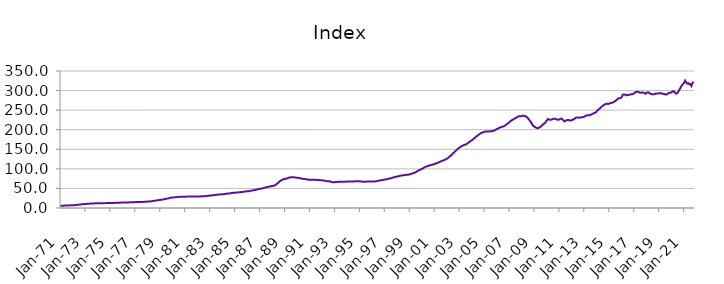
| Category | Index |
|---|---|
| 1971-01-01 | 5.879 |
| 1971-02-01 | 5.921 |
| 1971-03-01 | 5.963 |
| 1971-04-01 | 6.018 |
| 1971-05-01 | 6.108 |
| 1971-06-01 | 6.203 |
| 1971-07-01 | 6.32 |
| 1971-08-01 | 6.446 |
| 1971-09-01 | 6.572 |
| 1971-10-01 | 6.703 |
| 1971-11-01 | 6.844 |
| 1971-12-01 | 7.015 |
| 1972-01-01 | 7.135 |
| 1972-02-01 | 7.213 |
| 1972-03-01 | 7.39 |
| 1972-04-01 | 7.638 |
| 1972-05-01 | 7.997 |
| 1972-06-01 | 8.312 |
| 1972-07-01 | 8.674 |
| 1972-08-01 | 9.023 |
| 1972-09-01 | 9.332 |
| 1972-10-01 | 9.62 |
| 1972-11-01 | 9.887 |
| 1972-12-01 | 10.162 |
| 1973-01-01 | 10.359 |
| 1973-02-01 | 10.498 |
| 1973-03-01 | 10.658 |
| 1973-04-01 | 10.841 |
| 1973-05-01 | 11.075 |
| 1973-06-01 | 11.227 |
| 1973-07-01 | 11.386 |
| 1973-08-01 | 11.562 |
| 1973-09-01 | 11.768 |
| 1973-10-01 | 11.982 |
| 1973-11-01 | 12.145 |
| 1973-12-01 | 12.262 |
| 1974-01-01 | 12.324 |
| 1974-02-01 | 12.392 |
| 1974-03-01 | 12.389 |
| 1974-04-01 | 12.362 |
| 1974-05-01 | 12.339 |
| 1974-06-01 | 12.34 |
| 1974-07-01 | 12.352 |
| 1974-08-01 | 12.392 |
| 1974-09-01 | 12.465 |
| 1974-10-01 | 12.555 |
| 1974-11-01 | 12.63 |
| 1974-12-01 | 12.703 |
| 1975-01-01 | 12.737 |
| 1975-02-01 | 12.78 |
| 1975-03-01 | 12.857 |
| 1975-04-01 | 12.965 |
| 1975-05-01 | 13.097 |
| 1975-06-01 | 13.168 |
| 1975-07-01 | 13.237 |
| 1975-08-01 | 13.332 |
| 1975-09-01 | 13.462 |
| 1975-10-01 | 13.606 |
| 1975-11-01 | 13.732 |
| 1975-12-01 | 13.867 |
| 1976-01-01 | 13.963 |
| 1976-02-01 | 14.052 |
| 1976-03-01 | 14.114 |
| 1976-04-01 | 14.179 |
| 1976-05-01 | 14.264 |
| 1976-06-01 | 14.32 |
| 1976-07-01 | 14.382 |
| 1976-08-01 | 14.474 |
| 1976-09-01 | 14.605 |
| 1976-10-01 | 14.752 |
| 1976-11-01 | 14.87 |
| 1976-12-01 | 14.976 |
| 1977-01-01 | 15.034 |
| 1977-02-01 | 15.102 |
| 1977-03-01 | 15.145 |
| 1977-04-01 | 15.197 |
| 1977-05-01 | 15.276 |
| 1977-06-01 | 15.347 |
| 1977-07-01 | 15.436 |
| 1977-08-01 | 15.557 |
| 1977-09-01 | 15.705 |
| 1977-10-01 | 15.871 |
| 1977-11-01 | 16.048 |
| 1977-12-01 | 16.278 |
| 1978-01-01 | 16.449 |
| 1978-02-01 | 16.582 |
| 1978-03-01 | 16.762 |
| 1978-04-01 | 17.003 |
| 1978-05-01 | 17.391 |
| 1978-06-01 | 17.783 |
| 1978-07-01 | 18.258 |
| 1978-08-01 | 18.744 |
| 1978-09-01 | 19.213 |
| 1978-10-01 | 19.678 |
| 1978-11-01 | 20.113 |
| 1978-12-01 | 20.542 |
| 1979-01-01 | 20.797 |
| 1979-02-01 | 20.968 |
| 1979-03-01 | 21.394 |
| 1979-04-01 | 21.979 |
| 1979-05-01 | 22.725 |
| 1979-06-01 | 23.198 |
| 1979-07-01 | 23.69 |
| 1979-08-01 | 24.243 |
| 1979-09-01 | 24.906 |
| 1979-10-01 | 25.613 |
| 1979-11-01 | 26.202 |
| 1979-12-01 | 26.66 |
| 1980-01-01 | 26.911 |
| 1980-02-01 | 27.107 |
| 1980-03-01 | 27.357 |
| 1980-04-01 | 27.651 |
| 1980-05-01 | 27.994 |
| 1980-06-01 | 28.178 |
| 1980-07-01 | 28.344 |
| 1980-08-01 | 28.498 |
| 1980-09-01 | 28.607 |
| 1980-10-01 | 28.676 |
| 1980-11-01 | 28.73 |
| 1980-12-01 | 28.843 |
| 1981-01-01 | 28.911 |
| 1981-02-01 | 29.013 |
| 1981-03-01 | 29.116 |
| 1981-04-01 | 29.254 |
| 1981-05-01 | 29.394 |
| 1981-06-01 | 29.441 |
| 1981-07-01 | 29.464 |
| 1981-08-01 | 29.469 |
| 1981-09-01 | 29.414 |
| 1981-10-01 | 29.312 |
| 1981-11-01 | 29.219 |
| 1981-12-01 | 29.209 |
| 1982-01-01 | 29.164 |
| 1982-02-01 | 29.184 |
| 1982-03-01 | 29.346 |
| 1982-04-01 | 29.618 |
| 1982-05-01 | 29.924 |
| 1982-06-01 | 30.035 |
| 1982-07-01 | 30.119 |
| 1982-08-01 | 30.28 |
| 1982-09-01 | 30.54 |
| 1982-10-01 | 30.849 |
| 1982-11-01 | 31.157 |
| 1982-12-01 | 31.538 |
| 1983-01-01 | 31.828 |
| 1983-02-01 | 32.078 |
| 1983-03-01 | 32.337 |
| 1983-04-01 | 32.659 |
| 1983-05-01 | 33.081 |
| 1983-06-01 | 33.413 |
| 1983-07-01 | 33.773 |
| 1983-08-01 | 34.116 |
| 1983-09-01 | 34.39 |
| 1983-10-01 | 34.614 |
| 1983-11-01 | 34.826 |
| 1983-12-01 | 35.104 |
| 1984-01-01 | 35.27 |
| 1984-02-01 | 35.438 |
| 1984-03-01 | 35.758 |
| 1984-04-01 | 36.202 |
| 1984-05-01 | 36.71 |
| 1984-06-01 | 36.936 |
| 1984-07-01 | 37.124 |
| 1984-08-01 | 37.411 |
| 1984-09-01 | 37.87 |
| 1984-10-01 | 38.4 |
| 1984-11-01 | 38.81 |
| 1984-12-01 | 39.095 |
| 1985-01-01 | 39.174 |
| 1985-02-01 | 39.283 |
| 1985-03-01 | 39.552 |
| 1985-04-01 | 39.93 |
| 1985-05-01 | 40.361 |
| 1985-06-01 | 40.527 |
| 1985-07-01 | 40.681 |
| 1985-08-01 | 40.948 |
| 1985-09-01 | 41.393 |
| 1985-10-01 | 41.902 |
| 1985-11-01 | 42.329 |
| 1985-12-01 | 42.671 |
| 1986-01-01 | 42.803 |
| 1986-02-01 | 42.939 |
| 1986-03-01 | 43.335 |
| 1986-04-01 | 43.908 |
| 1986-05-01 | 44.624 |
| 1986-06-01 | 45.057 |
| 1986-07-01 | 45.499 |
| 1986-08-01 | 46.028 |
| 1986-09-01 | 46.692 |
| 1986-10-01 | 47.409 |
| 1986-11-01 | 48.06 |
| 1986-12-01 | 48.667 |
| 1987-01-01 | 49.02 |
| 1987-02-01 | 49.311 |
| 1987-03-01 | 49.944 |
| 1987-04-01 | 50.795 |
| 1987-05-01 | 51.813 |
| 1987-06-01 | 52.387 |
| 1987-07-01 | 52.937 |
| 1987-08-01 | 53.541 |
| 1987-09-01 | 54.197 |
| 1987-10-01 | 54.877 |
| 1987-11-01 | 55.513 |
| 1987-12-01 | 56.172 |
| 1988-01-01 | 56.486 |
| 1988-02-01 | 56.756 |
| 1988-03-01 | 57.701 |
| 1988-04-01 | 59.124 |
| 1988-05-01 | 61.264 |
| 1988-06-01 | 63.424 |
| 1988-07-01 | 65.968 |
| 1988-08-01 | 68.307 |
| 1988-09-01 | 70.109 |
| 1988-10-01 | 71.604 |
| 1988-11-01 | 72.807 |
| 1988-12-01 | 73.875 |
| 1989-01-01 | 74.434 |
| 1989-02-01 | 74.906 |
| 1989-03-01 | 75.707 |
| 1989-04-01 | 76.727 |
| 1989-05-01 | 77.807 |
| 1989-06-01 | 78.279 |
| 1989-07-01 | 78.601 |
| 1989-08-01 | 78.752 |
| 1989-09-01 | 78.622 |
| 1989-10-01 | 78.258 |
| 1989-11-01 | 77.774 |
| 1989-12-01 | 77.38 |
| 1990-01-01 | 77.025 |
| 1990-02-01 | 77.011 |
| 1990-03-01 | 76.482 |
| 1990-04-01 | 75.796 |
| 1990-05-01 | 74.994 |
| 1990-06-01 | 74.611 |
| 1990-07-01 | 74.285 |
| 1990-08-01 | 73.967 |
| 1990-09-01 | 73.52 |
| 1990-10-01 | 73.009 |
| 1990-11-01 | 72.535 |
| 1990-12-01 | 72.334 |
| 1991-01-01 | 72.192 |
| 1991-02-01 | 72.268 |
| 1991-03-01 | 72.153 |
| 1991-04-01 | 72.077 |
| 1991-05-01 | 71.977 |
| 1991-06-01 | 71.933 |
| 1991-07-01 | 71.885 |
| 1991-08-01 | 71.819 |
| 1991-09-01 | 71.705 |
| 1991-10-01 | 71.501 |
| 1991-11-01 | 71.166 |
| 1991-12-01 | 70.813 |
| 1992-01-01 | 70.463 |
| 1992-02-01 | 70.409 |
| 1992-03-01 | 69.918 |
| 1992-04-01 | 69.325 |
| 1992-05-01 | 68.671 |
| 1992-06-01 | 68.457 |
| 1992-07-01 | 68.303 |
| 1992-08-01 | 67.98 |
| 1992-09-01 | 67.29 |
| 1992-10-01 | 66.434 |
| 1992-11-01 | 65.854 |
| 1992-12-01 | 65.871 |
| 1993-01-01 | 66.034 |
| 1993-02-01 | 66.322 |
| 1993-03-01 | 66.581 |
| 1993-04-01 | 66.905 |
| 1993-05-01 | 67.182 |
| 1993-06-01 | 67.213 |
| 1993-07-01 | 67.233 |
| 1993-08-01 | 67.289 |
| 1993-09-01 | 67.247 |
| 1993-10-01 | 67.126 |
| 1993-11-01 | 67.046 |
| 1993-12-01 | 67.281 |
| 1994-01-01 | 67.604 |
| 1994-02-01 | 68.006 |
| 1994-03-01 | 67.991 |
| 1994-04-01 | 67.827 |
| 1994-05-01 | 67.683 |
| 1994-06-01 | 67.696 |
| 1994-07-01 | 67.777 |
| 1994-08-01 | 67.944 |
| 1994-09-01 | 68.21 |
| 1994-10-01 | 68.532 |
| 1994-11-01 | 68.685 |
| 1994-12-01 | 68.595 |
| 1995-01-01 | 68.092 |
| 1995-02-01 | 67.66 |
| 1995-03-01 | 67.497 |
| 1995-04-01 | 67.327 |
| 1995-05-01 | 67.356 |
| 1995-06-01 | 67.213 |
| 1995-07-01 | 67.36 |
| 1995-08-01 | 67.425 |
| 1995-09-01 | 67.463 |
| 1995-10-01 | 67.439 |
| 1995-11-01 | 67.524 |
| 1995-12-01 | 67.607 |
| 1996-01-01 | 67.632 |
| 1996-02-01 | 67.59 |
| 1996-03-01 | 67.814 |
| 1996-04-01 | 68.077 |
| 1996-05-01 | 68.578 |
| 1996-06-01 | 68.945 |
| 1996-07-01 | 69.543 |
| 1996-08-01 | 70.122 |
| 1996-09-01 | 70.708 |
| 1996-10-01 | 71.134 |
| 1996-11-01 | 71.585 |
| 1996-12-01 | 72.224 |
| 1997-01-01 | 72.682 |
| 1997-02-01 | 73.17 |
| 1997-03-01 | 73.587 |
| 1997-04-01 | 74.264 |
| 1997-05-01 | 75.148 |
| 1997-06-01 | 75.819 |
| 1997-07-01 | 76.292 |
| 1997-08-01 | 77.048 |
| 1997-09-01 | 77.723 |
| 1997-10-01 | 78.598 |
| 1997-11-01 | 79.21 |
| 1997-12-01 | 79.988 |
| 1998-01-01 | 80.449 |
| 1998-02-01 | 81.141 |
| 1998-03-01 | 81.745 |
| 1998-04-01 | 82.495 |
| 1998-05-01 | 83.027 |
| 1998-06-01 | 83.355 |
| 1998-07-01 | 83.747 |
| 1998-08-01 | 84.113 |
| 1998-09-01 | 84.484 |
| 1998-10-01 | 84.731 |
| 1998-11-01 | 85.018 |
| 1998-12-01 | 85.363 |
| 1999-01-01 | 85.875 |
| 1999-02-01 | 86.896 |
| 1999-03-01 | 87.796 |
| 1999-04-01 | 88.688 |
| 1999-05-01 | 89.666 |
| 1999-06-01 | 90.701 |
| 1999-07-01 | 91.918 |
| 1999-08-01 | 93.495 |
| 1999-09-01 | 95.101 |
| 1999-10-01 | 96.577 |
| 1999-11-01 | 97.58 |
| 1999-12-01 | 98.926 |
| 2000-01-01 | 100 |
| 2000-02-01 | 101.936 |
| 2000-03-01 | 103.455 |
| 2000-04-01 | 105.075 |
| 2000-05-01 | 105.895 |
| 2000-06-01 | 106.901 |
| 2000-07-01 | 107.798 |
| 2000-08-01 | 108.633 |
| 2000-09-01 | 109.409 |
| 2000-10-01 | 110.207 |
| 2000-11-01 | 110.863 |
| 2000-12-01 | 111.699 |
| 2001-01-01 | 112.376 |
| 2001-02-01 | 113.427 |
| 2001-03-01 | 114.41 |
| 2001-04-01 | 115.617 |
| 2001-05-01 | 116.92 |
| 2001-06-01 | 118 |
| 2001-07-01 | 119.178 |
| 2001-08-01 | 120.352 |
| 2001-09-01 | 121.415 |
| 2001-10-01 | 122.129 |
| 2001-11-01 | 123.346 |
| 2001-12-01 | 124.695 |
| 2002-01-01 | 126.498 |
| 2002-02-01 | 128.249 |
| 2002-03-01 | 130.341 |
| 2002-04-01 | 132.594 |
| 2002-05-01 | 135.137 |
| 2002-06-01 | 137.714 |
| 2002-07-01 | 140.534 |
| 2002-08-01 | 143.04 |
| 2002-09-01 | 145.7 |
| 2002-10-01 | 148.191 |
| 2002-11-01 | 150.379 |
| 2002-12-01 | 152.788 |
| 2003-01-01 | 154.938 |
| 2003-02-01 | 156.702 |
| 2003-03-01 | 158.127 |
| 2003-04-01 | 159.492 |
| 2003-05-01 | 160.649 |
| 2003-06-01 | 161.58 |
| 2003-07-01 | 162.401 |
| 2003-08-01 | 164.014 |
| 2003-09-01 | 165.699 |
| 2003-10-01 | 167.901 |
| 2003-11-01 | 170.039 |
| 2003-12-01 | 171.829 |
| 2004-01-01 | 173.609 |
| 2004-02-01 | 175.589 |
| 2004-03-01 | 177.991 |
| 2004-04-01 | 180.138 |
| 2004-05-01 | 182.465 |
| 2004-06-01 | 184.54 |
| 2004-07-01 | 186.551 |
| 2004-08-01 | 188.625 |
| 2004-09-01 | 190.257 |
| 2004-10-01 | 192.019 |
| 2004-11-01 | 192.962 |
| 2004-12-01 | 193.904 |
| 2005-01-01 | 194.627 |
| 2005-02-01 | 195.72 |
| 2005-03-01 | 195.655 |
| 2005-04-01 | 195.754 |
| 2005-05-01 | 195.194 |
| 2005-06-01 | 195.793 |
| 2005-07-01 | 195.867 |
| 2005-08-01 | 196.175 |
| 2005-09-01 | 196.736 |
| 2005-10-01 | 197.938 |
| 2005-11-01 | 198.884 |
| 2005-12-01 | 200.645 |
| 2006-01-01 | 201.661 |
| 2006-02-01 | 203.374 |
| 2006-03-01 | 204.511 |
| 2006-04-01 | 205.861 |
| 2006-05-01 | 206.826 |
| 2006-06-01 | 207.511 |
| 2006-07-01 | 208.388 |
| 2006-08-01 | 209.567 |
| 2006-09-01 | 211.353 |
| 2006-10-01 | 213.443 |
| 2006-11-01 | 215.14 |
| 2006-12-01 | 217.475 |
| 2007-01-01 | 219.496 |
| 2007-02-01 | 222.231 |
| 2007-03-01 | 223.7 |
| 2007-04-01 | 225.58 |
| 2007-05-01 | 226.869 |
| 2007-06-01 | 228.812 |
| 2007-07-01 | 229.701 |
| 2007-08-01 | 231.63 |
| 2007-09-01 | 233.384 |
| 2007-10-01 | 234.664 |
| 2007-11-01 | 234.312 |
| 2007-12-01 | 234.555 |
| 2008-01-01 | 235.086 |
| 2008-02-01 | 236.026 |
| 2008-03-01 | 235.364 |
| 2008-04-01 | 234.965 |
| 2008-05-01 | 233.6 |
| 2008-06-01 | 231.702 |
| 2008-07-01 | 228.29 |
| 2008-08-01 | 225.152 |
| 2008-09-01 | 221.485 |
| 2008-10-01 | 217.485 |
| 2008-11-01 | 212.758 |
| 2008-12-01 | 209.323 |
| 2009-01-01 | 207.652 |
| 2009-02-01 | 206.212 |
| 2009-03-01 | 204.576 |
| 2009-04-01 | 203.86 |
| 2009-05-01 | 204.572 |
| 2009-06-01 | 206.247 |
| 2009-07-01 | 207.906 |
| 2009-08-01 | 210.209 |
| 2009-09-01 | 213.072 |
| 2009-10-01 | 215.548 |
| 2009-11-01 | 216.169 |
| 2009-12-01 | 220.435 |
| 2010-01-01 | 223.882 |
| 2010-02-01 | 227.544 |
| 2010-03-01 | 226.207 |
| 2010-04-01 | 225.371 |
| 2010-05-01 | 225.616 |
| 2010-06-01 | 226.496 |
| 2010-07-01 | 227.242 |
| 2010-08-01 | 228.031 |
| 2010-09-01 | 227.934 |
| 2010-10-01 | 227.086 |
| 2010-11-01 | 225.565 |
| 2010-12-01 | 225.596 |
| 2011-01-01 | 226.214 |
| 2011-02-01 | 228.039 |
| 2011-03-01 | 228.503 |
| 2011-04-01 | 226.162 |
| 2011-05-01 | 223.102 |
| 2011-06-01 | 221.419 |
| 2011-07-01 | 222.781 |
| 2011-08-01 | 224.513 |
| 2011-09-01 | 224.472 |
| 2011-10-01 | 224.841 |
| 2011-11-01 | 223.579 |
| 2011-12-01 | 223.822 |
| 2012-01-01 | 224.584 |
| 2012-02-01 | 225.473 |
| 2012-03-01 | 227.466 |
| 2012-04-01 | 228.575 |
| 2012-05-01 | 231.11 |
| 2012-06-01 | 231.251 |
| 2012-07-01 | 231.282 |
| 2012-08-01 | 230.612 |
| 2012-09-01 | 231.126 |
| 2012-10-01 | 231.503 |
| 2012-11-01 | 231.747 |
| 2012-12-01 | 232.346 |
| 2013-01-01 | 233.26 |
| 2013-02-01 | 235.199 |
| 2013-03-01 | 236.287 |
| 2013-04-01 | 236.897 |
| 2013-05-01 | 236.822 |
| 2013-06-01 | 237.016 |
| 2013-07-01 | 237.888 |
| 2013-08-01 | 239.493 |
| 2013-09-01 | 240.786 |
| 2013-10-01 | 242.115 |
| 2013-11-01 | 242.898 |
| 2013-12-01 | 244.057 |
| 2014-01-01 | 247.816 |
| 2014-02-01 | 250.169 |
| 2014-03-01 | 252.769 |
| 2014-04-01 | 254.326 |
| 2014-05-01 | 257.246 |
| 2014-06-01 | 260.069 |
| 2014-07-01 | 261.53 |
| 2014-08-01 | 263.472 |
| 2014-09-01 | 264.905 |
| 2014-10-01 | 266.07 |
| 2014-11-01 | 266.347 |
| 2014-12-01 | 265.659 |
| 2015-01-01 | 266.928 |
| 2015-02-01 | 267.88 |
| 2015-03-01 | 268.307 |
| 2015-04-01 | 269.155 |
| 2015-05-01 | 270.34 |
| 2015-06-01 | 272.163 |
| 2015-07-01 | 273.277 |
| 2015-08-01 | 276.288 |
| 2015-09-01 | 278.116 |
| 2015-10-01 | 280.486 |
| 2015-11-01 | 280.294 |
| 2015-12-01 | 281.199 |
| 2016-01-01 | 283.607 |
| 2016-02-01 | 289.619 |
| 2016-03-01 | 290.057 |
| 2016-04-01 | 289.886 |
| 2016-05-01 | 287.681 |
| 2016-06-01 | 288.483 |
| 2016-07-01 | 288.661 |
| 2016-08-01 | 289.259 |
| 2016-09-01 | 289.711 |
| 2016-10-01 | 290.701 |
| 2016-11-01 | 290.463 |
| 2016-12-01 | 291.375 |
| 2017-01-01 | 293.717 |
| 2017-02-01 | 295.456 |
| 2017-03-01 | 297.078 |
| 2017-04-01 | 296.912 |
| 2017-05-01 | 296.553 |
| 2017-06-01 | 295.078 |
| 2017-07-01 | 294.677 |
| 2017-08-01 | 294.669 |
| 2017-09-01 | 295.305 |
| 2017-10-01 | 294.345 |
| 2017-11-01 | 293.162 |
| 2017-12-01 | 292.069 |
| 2018-01-01 | 294.449 |
| 2018-02-01 | 295.846 |
| 2018-03-01 | 294.92 |
| 2018-04-01 | 292.924 |
| 2018-05-01 | 291.472 |
| 2018-06-01 | 291.002 |
| 2018-07-01 | 290.236 |
| 2018-08-01 | 290.758 |
| 2018-09-01 | 291.058 |
| 2018-10-01 | 292.824 |
| 2018-11-01 | 292.65 |
| 2018-12-01 | 292.367 |
| 2019-01-01 | 292.519 |
| 2019-02-01 | 293.9 |
| 2019-03-01 | 292.871 |
| 2019-04-01 | 291.841 |
| 2019-05-01 | 291.513 |
| 2019-06-01 | 290.998 |
| 2019-07-01 | 290.148 |
| 2019-08-01 | 289.99 |
| 2019-09-01 | 291.573 |
| 2019-10-01 | 293.571 |
| 2019-11-01 | 294.348 |
| 2019-12-01 | 294.551 |
| 2020-01-01 | 295.866 |
| 2020-02-01 | 298.222 |
| 2020-03-01 | 298.209 |
| 2020-04-01 | 295.219 |
| 2020-05-01 | 292.362 |
| 2020-06-01 | 292.368 |
| 2020-07-01 | 295.543 |
| 2020-08-01 | 300.082 |
| 2020-09-01 | 304.427 |
| 2020-10-01 | 309.885 |
| 2020-11-01 | 313.48 |
| 2020-12-01 | 317.137 |
| 2021-01-01 | 319.74 |
| 2021-02-01 | 325.539 |
| 2021-03-01 | 321.13 |
| 2021-04-01 | 317.743 |
| 2021-05-01 | 318.875 |
| 2021-06-01 | 316.24 |
| 2021-07-01 | 316.463 |
| 2021-08-01 | 311.69 |
| 2021-09-01 | 318.493 |
| 2021-10-01 | 322.825 |